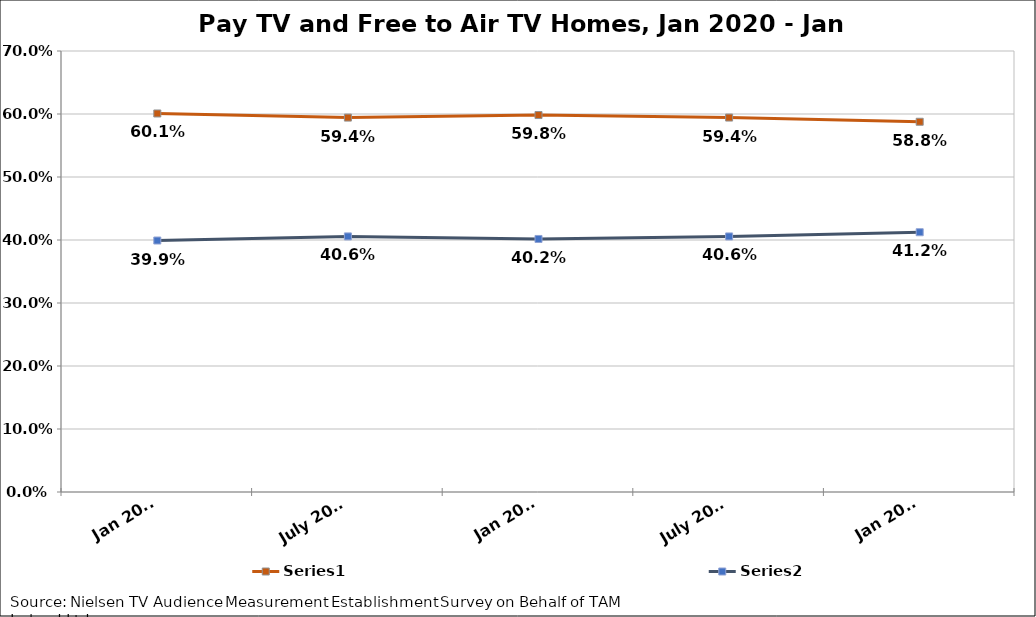
| Category | Series 2 | Series 6 |
|---|---|---|
| Jan 2020 | 0.601 | 0.399 |
| July 2020 | 0.594 | 0.406 |
| Jan 2021 | 0.598 | 0.402 |
| July 2021 | 0.594 | 0.406 |
| Jan 2022 | 0.588 | 0.412 |